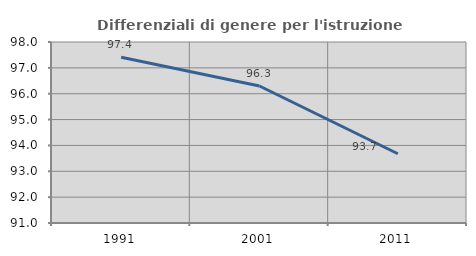
| Category | Differenziali di genere per l'istruzione superiore |
|---|---|
| 1991.0 | 97.41 |
| 2001.0 | 96.298 |
| 2011.0 | 93.678 |